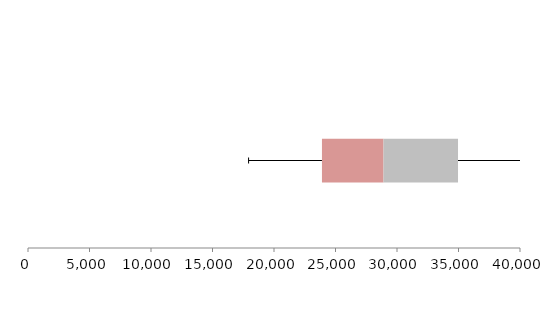
| Category | Series 1 | Series 2 | Series 3 |
|---|---|---|---|
| 0 | 23898.783 | 5003.73 | 6057.676 |